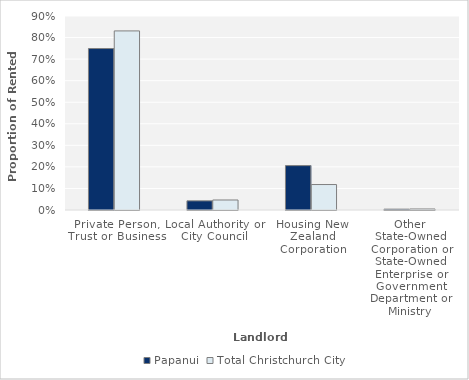
| Category | Papanui | Total Christchurch City |
|---|---|---|
| Private Person, Trust or Business | 0.749 | 0.831 |
| Local Authority or City Council | 0.042 | 0.046 |
| Housing New Zealand Corporation | 0.206 | 0.118 |
| Other State-Owned Corporation or State-Owned Enterprise or Government Department or Ministry | 0.004 | 0.005 |